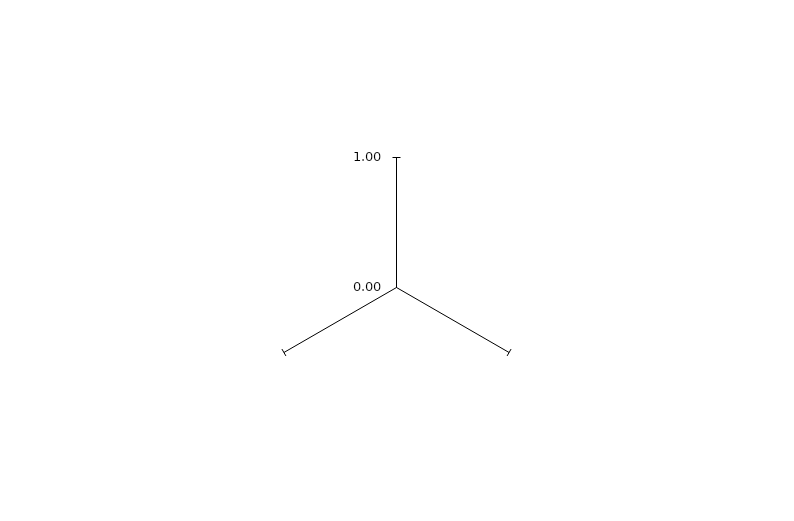
| Category | Valeurs des incateurs | Valeurs moyennes des indicateurs | max |
|---|---|---|---|
|  | 0 |  |  |
|  | 0 |  |  |
|  | 0 |  |  |